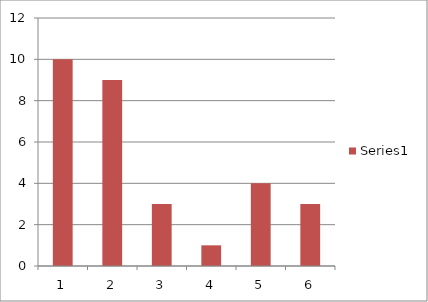
| Category | Series 1 |
|---|---|
| 0 | 10 |
| 1 | 9 |
| 2 | 3 |
| 3 | 1 |
| 4 | 4 |
| 5 | 3 |